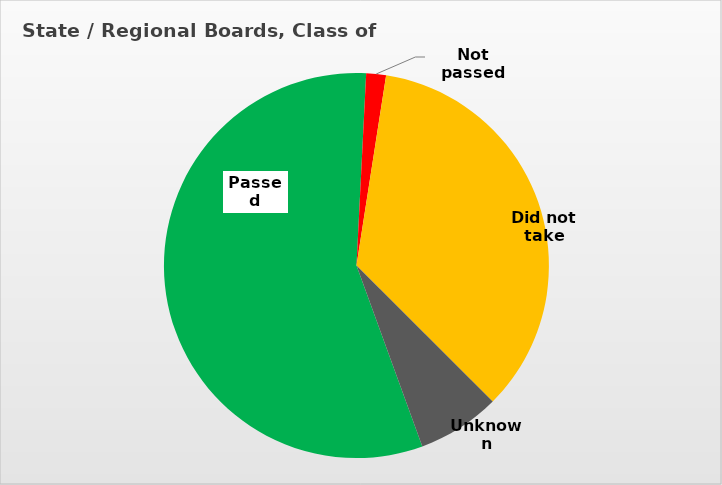
| Category | Series 0 |
|---|---|
| Passed | 0.564 |
| Not passed | 0.017 |
| Did not take | 0.35 |
| Unknown | 0.07 |